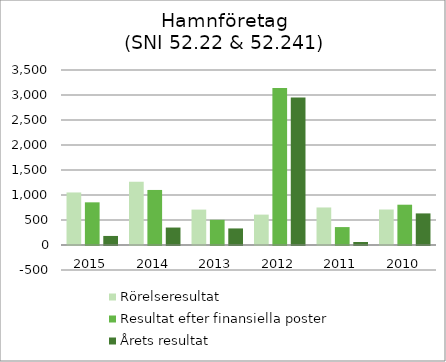
| Category | Rörelseresultat | Resultat efter finansiella poster | Årets resultat |
|---|---|---|---|
| 2015.0 | 1050.828 | 853.351 | 181.095 |
| 2014.0 | 1262.596 | 1100.869 | 349.191 |
| 2013.0 | 707.936 | 503.546 | 331.395 |
| 2012.0 | 607.815 | 3138.647 | 2949.896 |
| 2011.0 | 750.551 | 358.3 | 60.482 |
| 2010.0 | 709.801 | 805.844 | 631.87 |